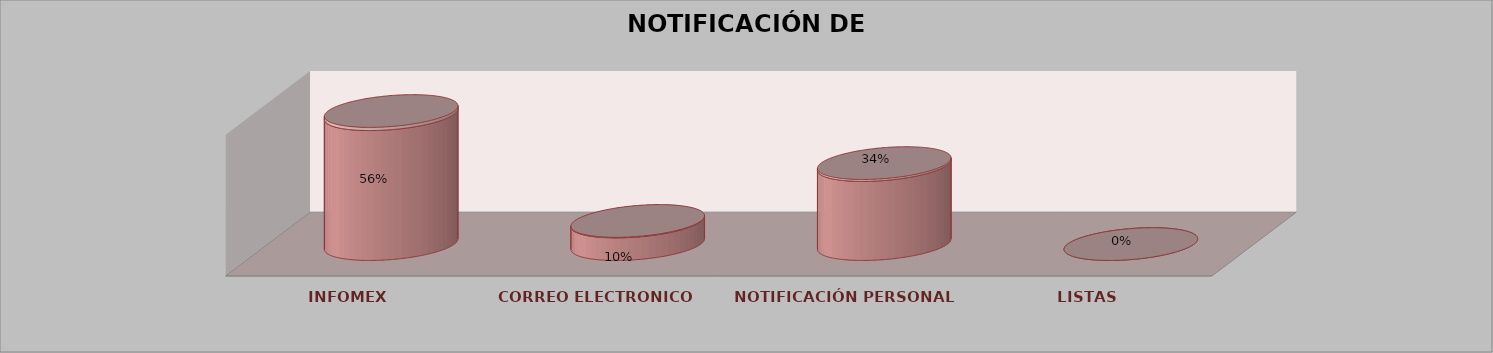
| Category | Series 0 | Series 1 | Series 2 | Series 3 | Series 4 |
|---|---|---|---|---|---|
| INFOMEX |  |  |  | 23 | 0.561 |
| CORREO ELECTRONICO |  |  |  | 4 | 0.098 |
| NOTIFICACIÓN PERSONAL |  |  |  | 14 | 0.341 |
| LISTAS |  |  |  | 0 | 0 |